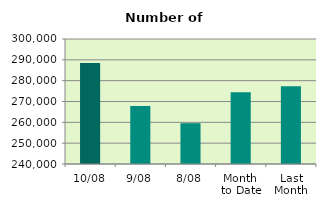
| Category | Series 0 |
|---|---|
| 10/08 | 288492 |
| 9/08 | 267846 |
| 8/08 | 259592 |
| Month 
to Date | 274402 |
| Last
Month | 277312.476 |